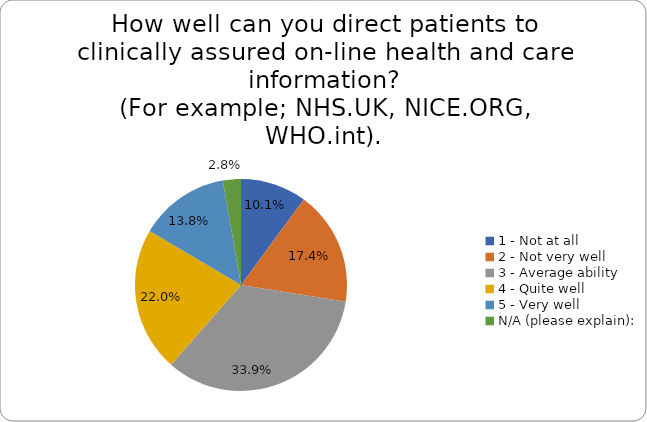
| Category | Series 0 |
|---|---|
| 1 - Not at all | 0.101 |
| 2 - Not very well | 0.174 |
| 3 - Average ability | 0.339 |
| 4 - Quite well | 0.22 |
| 5 - Very well | 0.138 |
| N/A (please explain): | 0.028 |